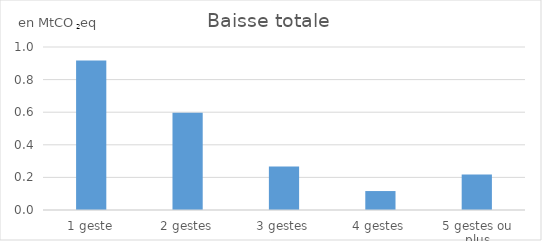
| Category | Baisse totale |
|---|---|
| 1 geste | 0.918 |
| 2 gestes | 0.597 |
| 3 gestes | 0.267 |
| 4 gestes | 0.116 |
| 5 gestes ou plus | 0.219 |